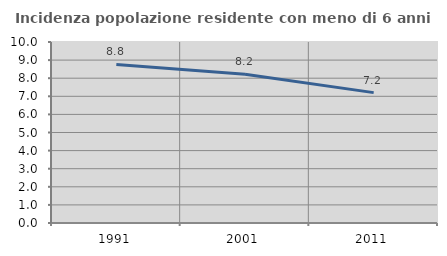
| Category | Incidenza popolazione residente con meno di 6 anni |
|---|---|
| 1991.0 | 8.761 |
| 2001.0 | 8.223 |
| 2011.0 | 7.203 |